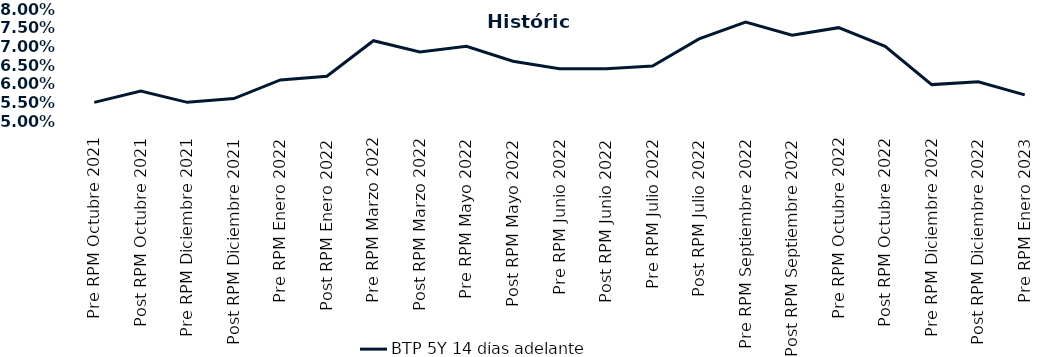
| Category | BTP 5Y 14 días adelante |
|---|---|
| Pre RPM Octubre 2021 | 0.055 |
| Post RPM Octubre 2021 | 0.058 |
| Pre RPM Diciembre 2021 | 0.055 |
| Post RPM Diciembre 2021 | 0.056 |
| Pre RPM Enero 2022 | 0.061 |
| Post RPM Enero 2022 | 0.062 |
| Pre RPM Marzo 2022 | 0.072 |
| Post RPM Marzo 2022 | 0.068 |
| Pre RPM Mayo 2022 | 0.07 |
| Post RPM Mayo 2022 | 0.066 |
| Pre RPM Junio 2022 | 0.064 |
| Post RPM Junio 2022 | 0.064 |
| Pre RPM Julio 2022 | 0.065 |
| Post RPM Julio 2022 | 0.072 |
| Pre RPM Septiembre 2022 | 0.076 |
| Post RPM Septiembre 2022 | 0.073 |
| Pre RPM Octubre 2022 | 0.075 |
| Post RPM Octubre 2022 | 0.07 |
| Pre RPM Diciembre 2022 | 0.06 |
| Post RPM Diciembre 2022 | 0.06 |
| Pre RPM Enero 2023 | 0.057 |